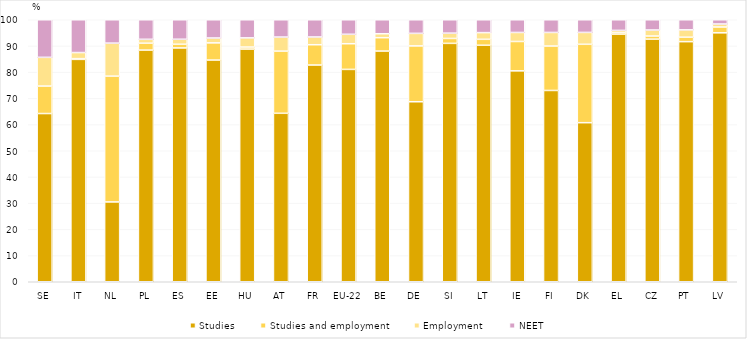
| Category | Studies | Studies and employment | Employment | NEET |
|---|---|---|---|---|
| SE | 64.201 | 10.488 | 10.966 | 14.344 |
| IT | 84.877 | 0.281 | 2.323 | 12.518 |
| NL | 30.466 | 48.013 | 12.595 | 8.925 |
| PL | 88.418 | 2.628 | 1.489 | 7.465 |
| ES | 89.247 | 1.4 | 1.912 | 7.44 |
| EE | 84.616 | 6.558 | 1.861 | 6.965 |
| HU | 88.805 | 0.767 | 3.515 | 6.913 |
| AT | 64.297 | 23.723 | 5.374 | 6.606 |
| FR | 82.721 | 7.748 | 2.956 | 6.575 |
| EU-22 | 81.049 | 9.8 | 3.603 | 6.281 |
| BE | 88.046 | 5.114 | 1.502 | 5.338 |
| DE | 68.704 | 21.309 | 4.792 | 5.195 |
| SI | 90.988 | 1.878 | 2.018 | 5.115 |
| LT | 90.264 | 2.271 | 2.556 | 4.909 |
| IE | 80.493 | 11.213 | 3.444 | 4.851 |
| FI | 73.01 | 16.955 | 5.19 | 4.844 |
| DK | 60.715 | 29.919 | 4.531 | 4.835 |
| EL | 94.478 | 0.628 | 0.829 | 4.066 |
| CZ | 92.591 | 1.191 | 2.307 | 3.911 |
| PT | 91.644 | 1.693 | 2.806 | 3.857 |
| LV | 95.012 | 2.22 | 1.142 | 1.626 |